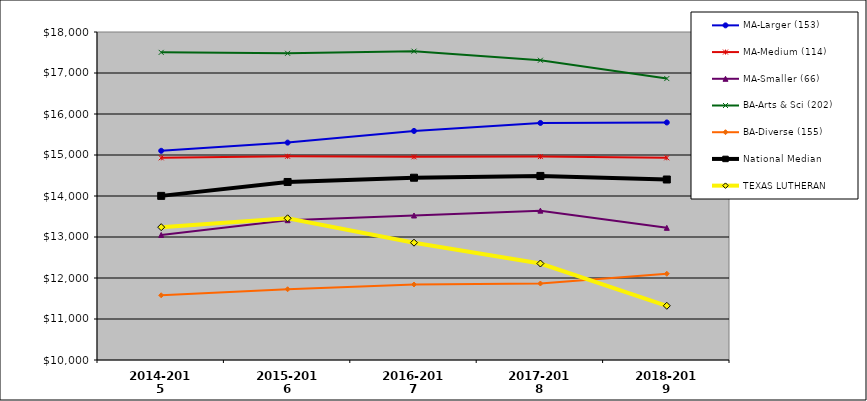
| Category | MA-Larger (153) | MA-Medium (114) | MA-Smaller (66) | BA-Arts & Sci (202) | BA-Diverse (155) | National Median |  TEXAS LUTHERAN  |
|---|---|---|---|---|---|---|---|
| 2014-2015 | 15102.291 | 14931.155 | 13049.382 | 17503.088 | 11578.321 | 14002.887 | 13239.91 |
| 2015-2016 | 15301.954 | 14968.103 | 13409.848 | 17480.428 | 11725.716 | 14342.086 | 13456.186 |
| 2016-2017 | 15586.769 | 14955.303 | 13524.707 | 17531.902 | 11841.78 | 14445.621 | 12861.172 |
| 2017-2018 | 15781.613 | 14960.758 | 13643.005 | 17311.015 | 11865.121 | 14489.448 | 12353.524 |
| 2018-2019 | 15793.474 | 14932.112 | 13223.926 | 16864.16 | 12102.81 | 14402.238 | 11322.153 |